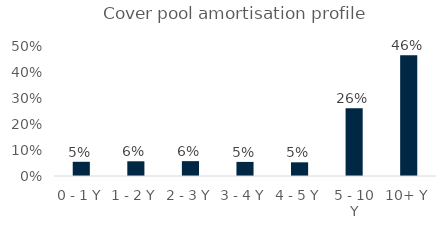
| Category | Series 0 |
|---|---|
| 0 - 1 Y | 0.055 |
| 1 - 2 Y | 0.057 |
| 2 - 3 Y | 0.057 |
| 3 - 4 Y | 0.054 |
| 4 - 5 Y | 0.053 |
| 5 - 10 Y | 0.261 |
| 10+ Y | 0.464 |